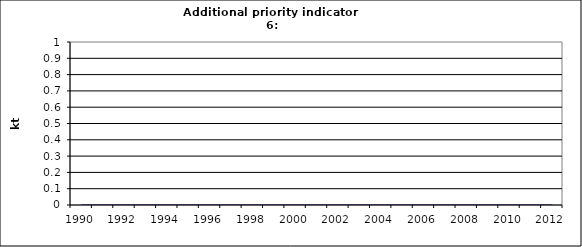
| Category | Cement production, kt |
|---|---|
| 1990 | 0 |
| 1991 | 0 |
| 1992 | 0 |
| 1993 | 0 |
| 1994 | 0 |
| 1995 | 0 |
| 1996 | 0 |
| 1997 | 0 |
| 1998 | 0 |
| 1999 | 0 |
| 2000 | 0 |
| 2001 | 0 |
| 2002 | 0 |
| 2003 | 0 |
| 2004 | 0 |
| 2005 | 0 |
| 2006 | 0 |
| 2007 | 0 |
| 2008 | 0 |
| 2009 | 0 |
| 2010 | 0 |
| 2011 | 0 |
| 2012 | 0 |